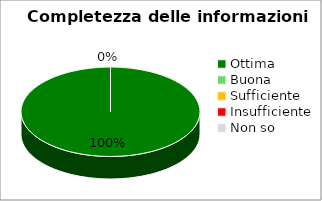
| Category | Series 0 |
|---|---|
| Ottima | 35 |
| Buona | 0 |
| Sufficiente | 0 |
| Insufficiente | 0 |
| Non so | 0 |